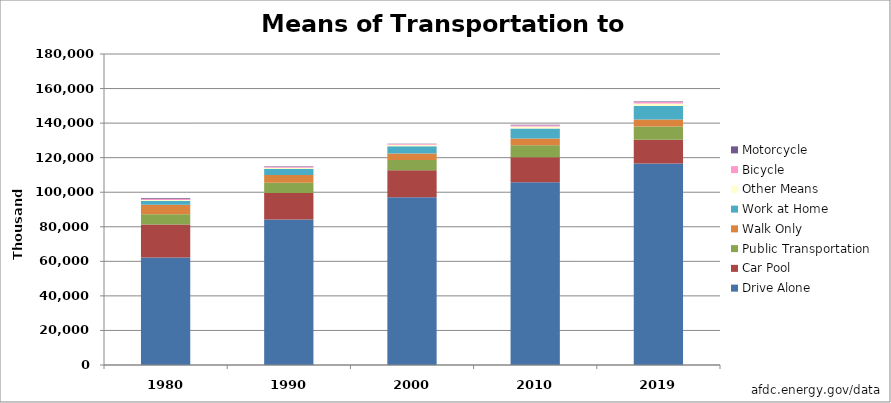
| Category | Drive Alone | Car Pool | Public Transportation | Walk Only | Work at Home | Other Means | Bicycle | Motorcycle |
|---|---|---|---|---|---|---|---|---|
| 1980.0 | 62193 | 19065 | 6008 | 5413 | 2180 | 703 | 468 | 419 |
| 1990.0 | 84215 | 15378 | 5889 | 4489 | 3406 | 809 | 467 | 237 |
| 2000.0 | 97102 | 15635 | 5868 | 3759 | 4184 | 901 | 488 | 142 |
| 2010.0 | 105841 | 14418 | 6873 | 3962 | 5760 | 1216 | 717 | 305 |
| 2019.0 | 116585 | 13764 | 7641 | 4074 | 7899 | 1412 | 838 | 238 |